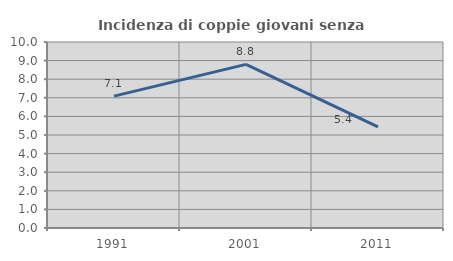
| Category | Incidenza di coppie giovani senza figli |
|---|---|
| 1991.0 | 7.092 |
| 2001.0 | 8.798 |
| 2011.0 | 5.439 |